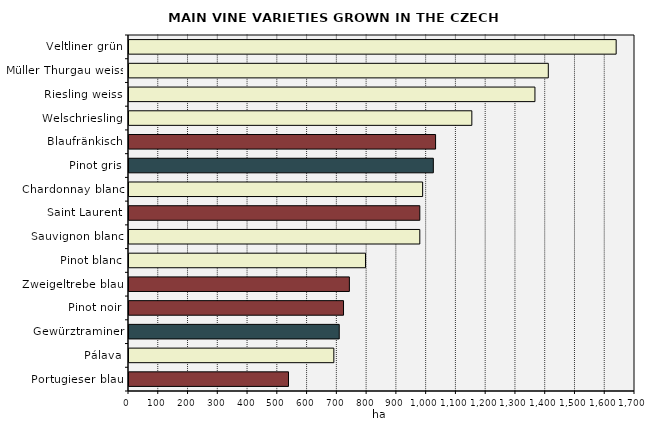
| Category | Series 0 |
|---|---|
| Veltliner grün | 1636.722 |
| Müller Thurgau weiss | 1408.71 |
| Riesling weiss | 1363.824 |
| Welschriesling | 1151.822 |
| Blaufränkisch | 1030.011 |
| Pinot gris | 1022.463 |
| Chardonnay blanc | 986.522 |
| Saint Laurent | 977.075 |
| Sauvignon blanc | 977.019 |
| Pinot blanc | 794.536 |
| Zweigeltrebe blau | 740.406 |
| Pinot noir | 720.708 |
| Gewürztraminer | 706.336 |
| Pálava | 688.201 |
| Portugieser blau | 535.822 |